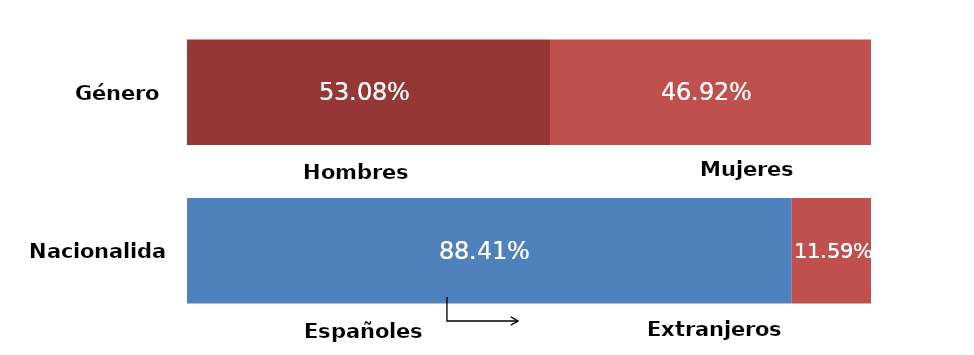
| Category | Series 0 | Series 1 |
|---|---|---|
| 0 | 0.531 | 0.469 |
| 1 | 0.884 | 0.116 |